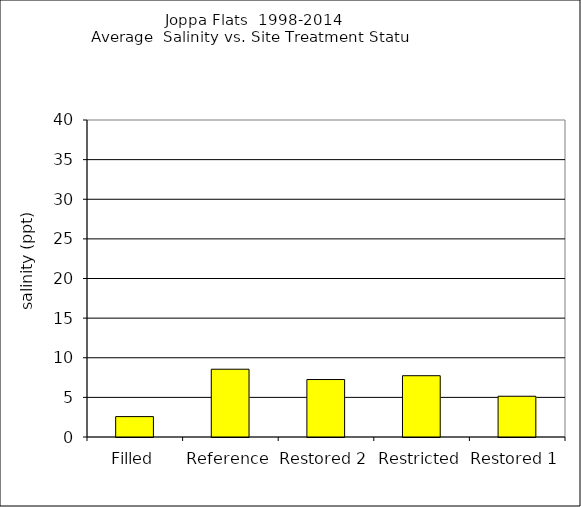
| Category | Grand Total |
|---|---|
| Filled | 2.574 |
| Reference | 8.553 |
| Restored 2 | 7.25 |
| Restricted | 7.733 |
| Restored 1 | 5.143 |